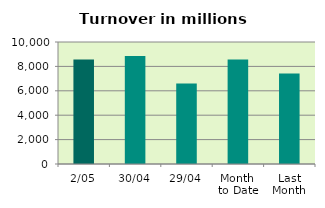
| Category | Series 0 |
|---|---|
| 2/05 | 8562.951 |
| 30/04 | 8845.431 |
| 29/04 | 6591.341 |
| Month 
to Date | 8562.951 |
| Last
Month | 7412.755 |